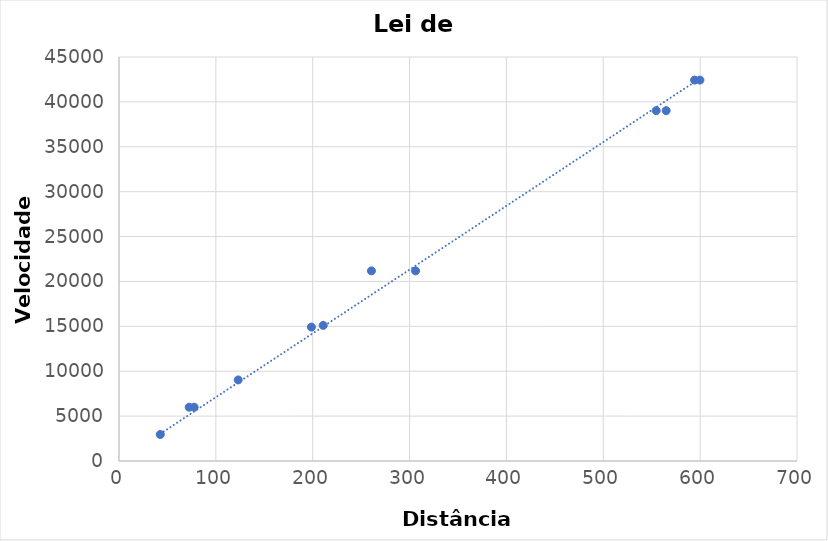
| Category | Series 0 |
|---|---|
| 72.44359600749897 | 5992.307 |
| 77.62471166286939 | 5992.307 |
| 594.2921586155752 | 42428.318 |
| 599.7910762555115 | 42428.318 |
| 210.86281499332927 | 15103.94 |
| 198.60949173573735 | 14914.95 |
| 564.9369748123042 | 39020.303 |
| 554.6257129579113 | 39020.303 |
| 306.1963433690692 | 21178.361 |
| 260.6153549998901 | 21178.361 |
| 123.02687708123825 | 9029.518 |
| 42.65795188015934 | 2955.096 |